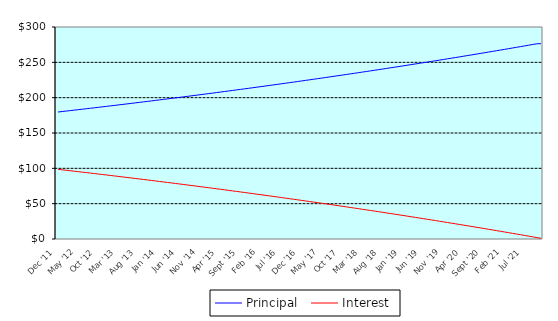
| Category | Principal | Interest |
|---|---|---|
| 0 | 179.71 | 98.58 |
| 1900-01-01 | 180.36 | 97.93 |
| 1900-01-02 | 181.02 | 97.27 |
| 1900-01-03 | 181.68 | 96.61 |
| 1900-01-04 | 182.35 | 95.94 |
| 1900-01-05 | 183.01 | 95.28 |
| 1900-01-06 | 183.68 | 94.61 |
| 1900-01-07 | 184.35 | 93.94 |
| 1900-01-08 | 185.02 | 93.27 |
| 1900-01-09 | 185.7 | 92.59 |
| 1900-01-10 | 186.38 | 91.91 |
| 1900-01-11 | 187.06 | 91.23 |
| 1900-01-12 | 187.74 | 90.55 |
| 1900-01-13 | 188.43 | 89.86 |
| 1900-01-14 | 189.11 | 89.18 |
| 1900-01-15 | 189.8 | 88.49 |
| 1900-01-16 | 190.5 | 87.79 |
| 1900-01-17 | 191.19 | 87.1 |
| 1900-01-18 | 191.89 | 86.4 |
| 1900-01-19 | 192.59 | 85.7 |
| 1900-01-20 | 193.29 | 85 |
| 1900-01-21 | 194 | 84.29 |
| 1900-01-22 | 194.71 | 83.58 |
| 1900-01-23 | 195.42 | 82.87 |
| 1900-01-24 | 196.13 | 82.16 |
| 1900-01-25 | 196.85 | 81.44 |
| 1900-01-26 | 197.57 | 80.72 |
| 1900-01-27 | 198.29 | 80 |
| 1900-01-28 | 199.01 | 79.28 |
| 1900-01-29 | 199.74 | 78.55 |
| 1900-01-30 | 200.47 | 77.82 |
| 1900-01-31 | 201.2 | 77.09 |
| 1900-02-01 | 201.94 | 76.35 |
| 1900-02-02 | 202.67 | 75.62 |
| 1900-02-03 | 203.41 | 74.88 |
| 1900-02-04 | 204.16 | 74.13 |
| 1900-02-05 | 204.9 | 73.39 |
| 1900-02-06 | 205.65 | 72.64 |
| 1900-02-07 | 206.4 | 71.89 |
| 1900-02-08 | 207.15 | 71.14 |
| 1900-02-09 | 207.91 | 70.38 |
| 1900-02-10 | 208.67 | 69.62 |
| 1900-02-11 | 209.43 | 68.86 |
| 1900-02-12 | 210.2 | 68.09 |
| 1900-02-13 | 210.96 | 67.33 |
| 1900-02-14 | 211.73 | 66.56 |
| 1900-02-15 | 212.51 | 65.78 |
| 1900-02-16 | 213.28 | 65.01 |
| 1900-02-17 | 214.06 | 64.23 |
| 1900-02-18 | 214.84 | 63.45 |
| 1900-02-19 | 215.63 | 62.66 |
| 1900-02-20 | 216.42 | 61.87 |
| 1900-02-21 | 217.21 | 61.08 |
| 1900-02-22 | 218 | 60.29 |
| 1900-02-23 | 218.79 | 59.5 |
| 1900-02-24 | 219.59 | 58.7 |
| 1900-02-25 | 220.4 | 57.89 |
| 1900-02-26 | 221.2 | 57.09 |
| 1900-02-27 | 222.01 | 56.28 |
| 1900-02-28 | 222.82 | 55.47 |
| 1900-02-28 | 223.63 | 54.66 |
| 1900-03-01 | 224.45 | 53.84 |
| 1900-03-02 | 225.27 | 53.02 |
| 1900-03-03 | 226.09 | 52.2 |
| 1900-03-04 | 226.92 | 51.37 |
| 1900-03-05 | 227.74 | 50.55 |
| 1900-03-06 | 228.58 | 49.71 |
| 1900-03-07 | 229.41 | 48.88 |
| 1900-03-08 | 230.25 | 48.04 |
| 1900-03-09 | 231.09 | 47.2 |
| 1900-03-10 | 231.93 | 46.36 |
| 1900-03-11 | 232.78 | 45.51 |
| 1900-03-12 | 233.63 | 44.66 |
| 1900-03-13 | 234.48 | 43.81 |
| 1900-03-14 | 235.34 | 42.95 |
| 1900-03-15 | 236.2 | 42.09 |
| 1900-03-16 | 237.06 | 41.23 |
| 1900-03-17 | 237.93 | 40.36 |
| 1900-03-18 | 238.79 | 39.5 |
| 1900-03-19 | 239.67 | 38.62 |
| 1900-03-20 | 240.54 | 37.75 |
| 1900-03-21 | 241.42 | 36.87 |
| 1900-03-22 | 242.3 | 35.99 |
| 1900-03-23 | 243.19 | 35.1 |
| 1900-03-24 | 244.07 | 34.22 |
| 1900-03-25 | 244.96 | 33.33 |
| 1900-03-26 | 245.86 | 32.43 |
| 1900-03-27 | 246.76 | 31.53 |
| 1900-03-28 | 247.66 | 30.63 |
| 1900-03-29 | 248.56 | 29.73 |
| 1900-03-30 | 249.47 | 28.82 |
| 1900-03-31 | 250.38 | 27.91 |
| 1900-04-01 | 251.29 | 27 |
| 1900-04-02 | 252.21 | 26.08 |
| 1900-04-03 | 253.13 | 25.16 |
| 1900-04-04 | 254.06 | 24.23 |
| 1900-04-05 | 254.99 | 23.3 |
| 1900-04-06 | 255.92 | 22.37 |
| 1900-04-07 | 256.85 | 21.44 |
| 1900-04-08 | 257.79 | 20.5 |
| 1900-04-09 | 258.73 | 19.56 |
| 1900-04-10 | 259.67 | 18.62 |
| 1900-04-11 | 260.62 | 17.67 |
| 1900-04-12 | 261.57 | 16.72 |
| 1900-04-13 | 262.53 | 15.76 |
| 1900-04-14 | 263.49 | 14.8 |
| 1900-04-15 | 264.45 | 13.84 |
| 1900-04-16 | 265.42 | 12.87 |
| 1900-04-17 | 266.38 | 11.91 |
| 1900-04-18 | 267.36 | 10.93 |
| 1900-04-19 | 268.33 | 9.96 |
| 1900-04-20 | 269.31 | 8.98 |
| 1900-04-21 | 270.3 | 7.99 |
| 1900-04-22 | 271.28 | 7.01 |
| 1900-04-23 | 272.27 | 6.02 |
| 1900-04-24 | 273.27 | 5.02 |
| 1900-04-25 | 274.27 | 4.02 |
| 1900-04-26 | 275.27 | 3.02 |
| 1900-04-27 | 276.27 | 2.02 |
| 1900-04-28 | 276.37 | 1.01 |